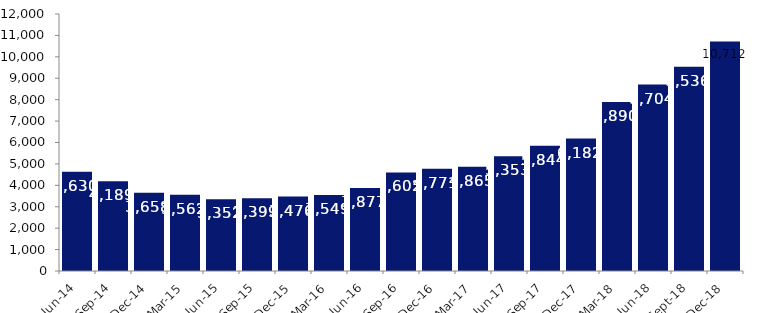
| Category | Series 0 |
|---|---|
| Jun-14 | 4630 |
| Sep-14 | 4189 |
| Dec-14 | 3658 |
| Mar-15 | 3562 |
| Jun-15 | 3352 |
| Sep-15 | 3399 |
| Dec-15 | 3476 |
| Mar-16 | 3549 |
| Jun-16 | 3877 |
| Sep-16 | 4602 |
| Dec-16 | 4771 |
| Mar-17 | 4865 |
| Jun-17 | 5353 |
| Sep-17 | 5844 |
| Dec-17 | 6182 |
| Mar-18 | 7890 |
| Jun-18 | 8704 |
| Sep-18 | 9536 |
| Dec-18 | 10712 |